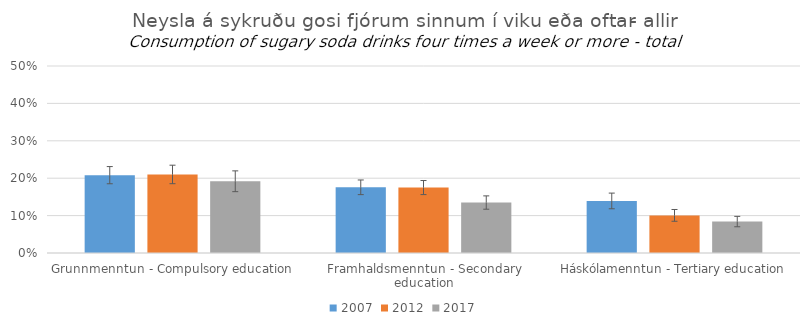
| Category | 2007 | 2012 | 2017 |
|---|---|---|---|
| Grunnmenntun - Compulsory education | 0.208 | 0.21 | 0.192 |
| Framhaldsmenntun - Secondary education | 0.176 | 0.175 | 0.135 |
| Háskólamenntun - Tertiary education | 0.139 | 0.101 | 0.084 |